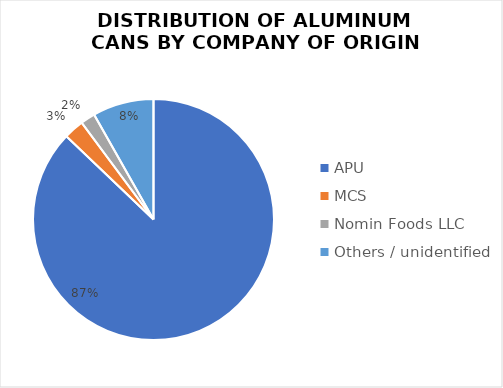
| Category | Series 0 |
|---|---|
| APU | 1286 |
| MCS | 40 |
| Nomin Foods LLC | 29 |
| Others / unidentified | 121 |